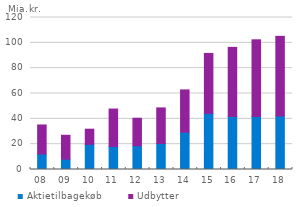
| Category | Aktietilbagekøb | Udbytter |
|---|---|---|
| 08 | 12.232 | 22.936 |
| 09 | 8.186 | 18.829 |
| 10 | 19.834 | 11.991 |
| 11 | 18.193 | 29.523 |
| 12 | 18.736 | 21.72 |
| 13 | 20.553 | 28.077 |
| 14 | 29.508 | 33.327 |
| 15 | 44.301 | 47.317 |
| 16 | 41.873 | 54.534 |
| 17 | 41.85 | 60.536 |
| 18 | 42.293 | 62.847 |